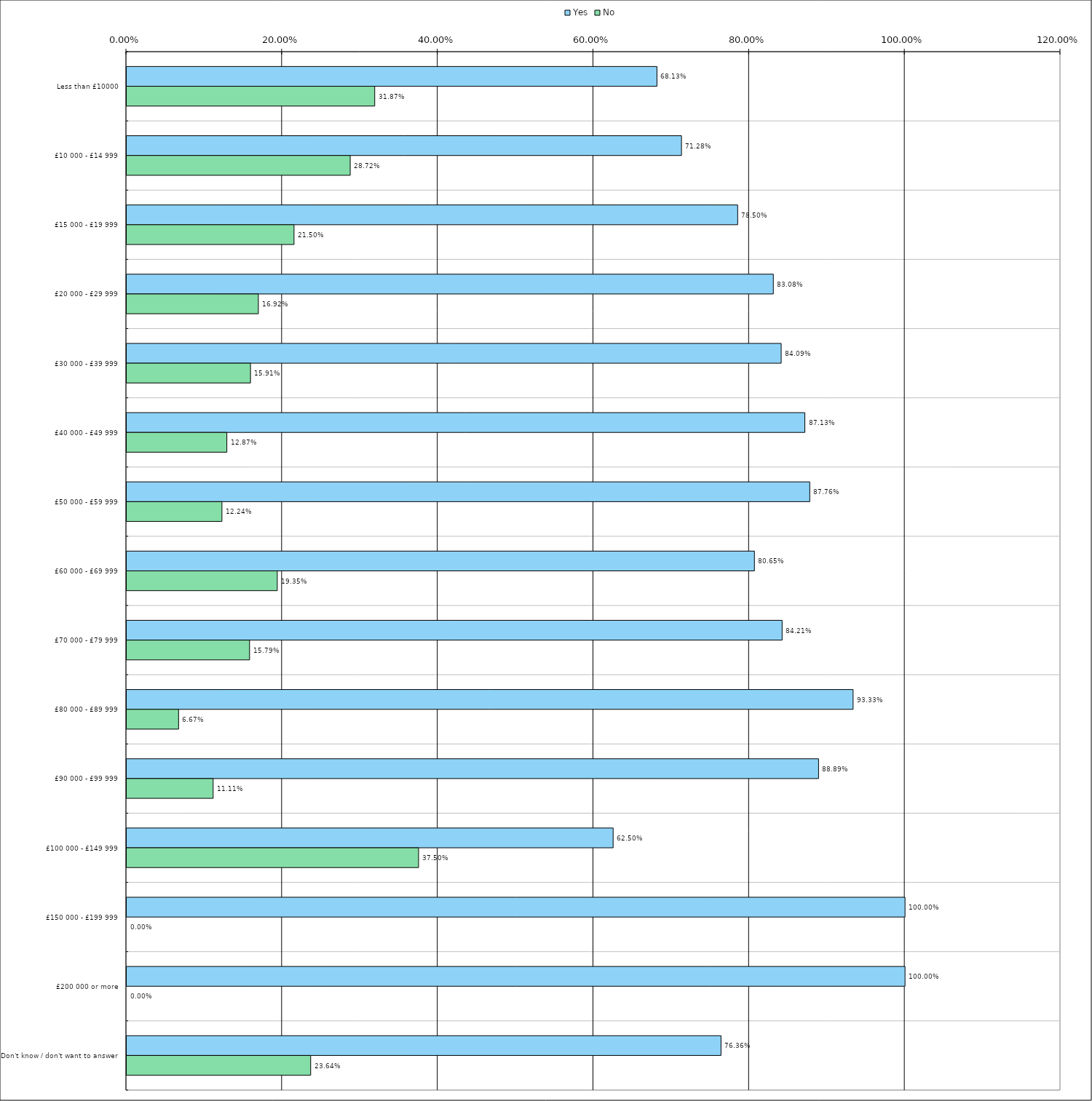
| Category | Yes | No |
|---|---|---|
| 0 | 0.681 | 0.319 |
| 1 | 0.713 | 0.287 |
| 2 | 0.785 | 0.215 |
| 3 | 0.831 | 0.169 |
| 4 | 0.841 | 0.159 |
| 5 | 0.871 | 0.129 |
| 6 | 0.878 | 0.122 |
| 7 | 0.806 | 0.194 |
| 8 | 0.842 | 0.158 |
| 9 | 0.933 | 0.067 |
| 10 | 0.889 | 0.111 |
| 11 | 0.625 | 0.375 |
| 12 | 1 | 0 |
| 13 | 1 | 0 |
| 14 | 0.764 | 0.236 |